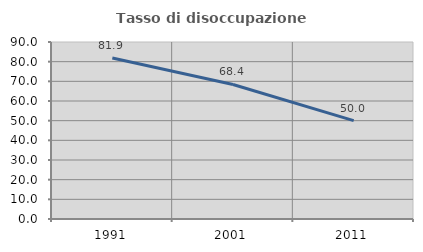
| Category | Tasso di disoccupazione giovanile  |
|---|---|
| 1991.0 | 81.879 |
| 2001.0 | 68.421 |
| 2011.0 | 50 |